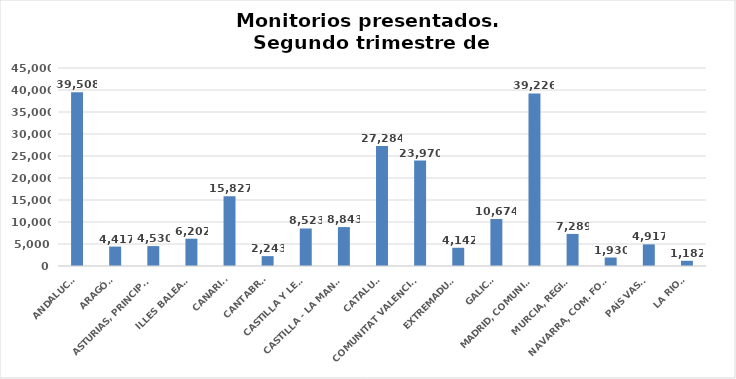
| Category | Series 0 |
|---|---|
| ANDALUCÍA | 39508 |
| ARAGÓN | 4417 |
| ASTURIAS, PRINCIPADO | 4530 |
| ILLES BALEARS | 6202 |
| CANARIAS | 15827 |
| CANTABRIA | 2243 |
| CASTILLA Y LEÓN | 8523 |
| CASTILLA - LA MANCHA | 8843 |
| CATALUÑA | 27284 |
| COMUNITAT VALENCIANA | 23970 |
| EXTREMADURA | 4142 |
| GALICIA | 10674 |
| MADRID, COMUNIDAD | 39226 |
| MURCIA, REGIÓN | 7289 |
| NAVARRA, COM. FORAL | 1930 |
| PAÍS VASCO | 4917 |
| LA RIOJA | 1182 |